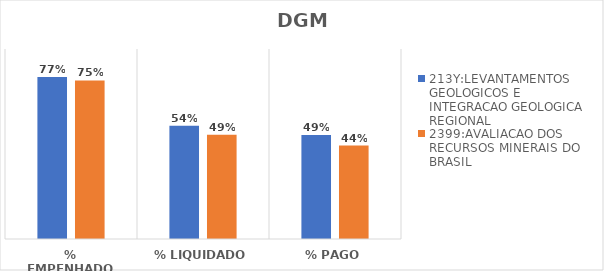
| Category | 213Y:LEVANTAMENTOS GEOLOGICOS E INTEGRACAO GEOLOGICA REGIONAL | 2399:AVALIACAO DOS RECURSOS MINERAIS DO BRASIL |
|---|---|---|
| % EMPENHADO | 0.767 | 0.751 |
| % LIQUIDADO | 0.536 | 0.493 |
| % PAGO | 0.493 | 0.443 |